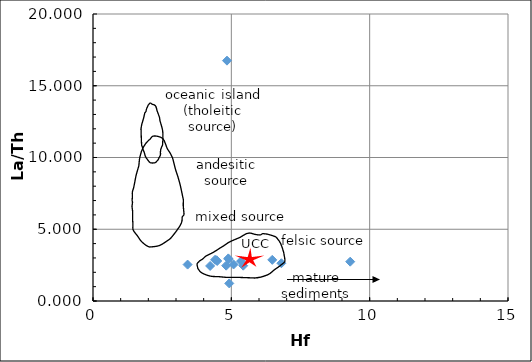
| Category | Series 0 |
|---|---|
| 4.411497348286286 | 2.873 |
| 6.47926611849134 | 2.867 |
| 4.901663720318095 | 2.912 |
| 4.842805159896953 | 16.749 |
| 4.891049881553627 | 2.969 |
| 5.429460975242111 | 2.46 |
| 4.489653797370098 | 2.787 |
| 3.419585871025065 | 2.538 |
| 4.813858326902948 | 2.461 |
| 4.466496330974894 | 2.841 |
| 9.296757863241112 | 2.74 |
| 5.351304526158299 | 2.776 |
| 5.081134084880923 | 2.546 |
| 4.233956772589725 | 2.443 |
| 4.9248211867133 | 1.226 |
| 6.808295120189858 | 2.631 |